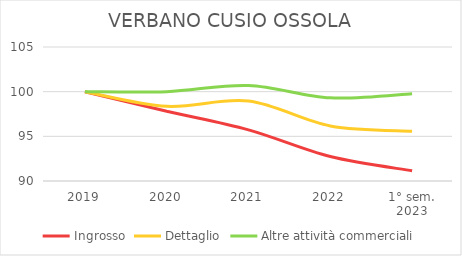
| Category | Ingrosso | Dettaglio | Altre attività commerciali |
|---|---|---|---|
| 2019 | 100 | 100 | 100 |
| 2020 | 97.811 | 98.356 | 100 |
| 2021 | 95.721 | 98.943 | 100.693 |
| 2022 | 92.736 | 96.164 | 99.307 |
| 1° sem.
2023 | 91.144 | 95.577 | 99.769 |